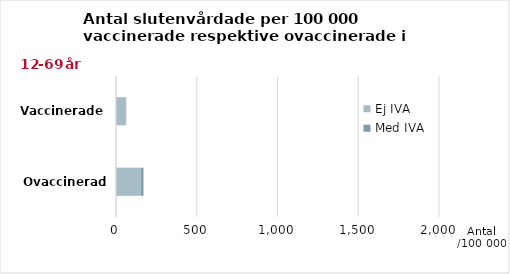
| Category | Ej IVA | Med IVA |
|---|---|---|
| Ovaccinerade  | 155.7 | 14.43 |
| Vaccinerade  | 59.496 | 3.417 |